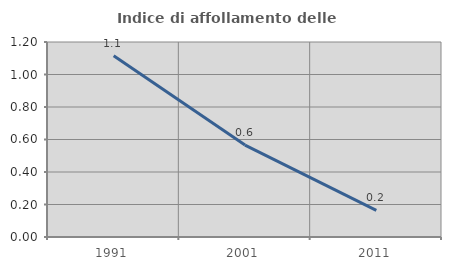
| Category | Indice di affollamento delle abitazioni  |
|---|---|
| 1991.0 | 1.115 |
| 2001.0 | 0.566 |
| 2011.0 | 0.164 |